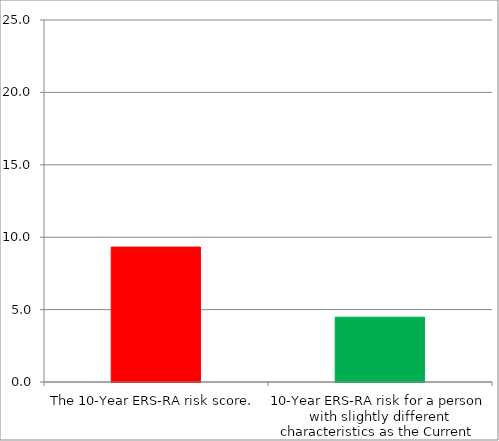
| Category | Series 0 |
|---|---|
| The 10-Year ERS-RA risk score. | 9.319 |
| 10-Year ERS-RA risk for a person with slightly different characteristics as the Current Profile. | 4.478 |